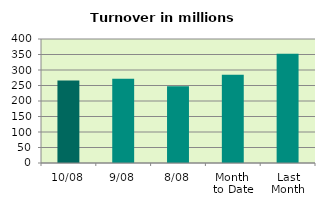
| Category | Series 0 |
|---|---|
| 10/08 | 266.147 |
| 9/08 | 271.915 |
| 8/08 | 247.265 |
| Month 
to Date | 284.311 |
| Last
Month | 352.063 |